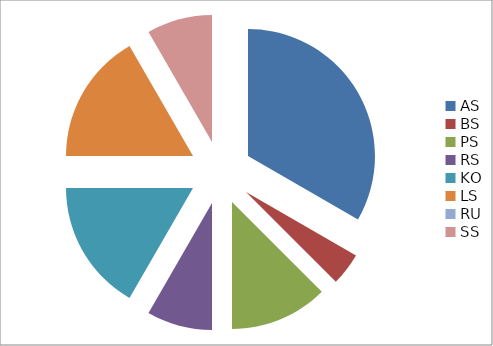
| Category | Series 0 |
|---|---|
| AS | 8 |
| BS | 1 |
| PS | 3 |
| RS | 2 |
| KO | 4 |
| LS | 4 |
| RU | 0 |
| SS | 2 |